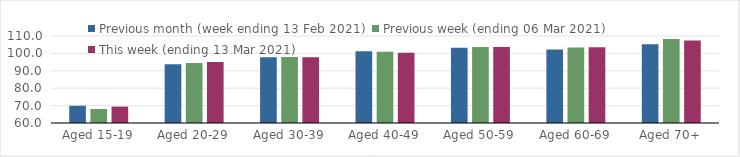
| Category | Previous month (week ending 13 Feb 2021) | Previous week (ending 06 Mar 2021) | This week (ending 13 Mar 2021) |
|---|---|---|---|
| Aged 15-19 | 69.91 | 68.03 | 69.42 |
| Aged 20-29 | 93.73 | 94.43 | 95.04 |
| Aged 30-39 | 97.75 | 97.86 | 97.81 |
| Aged 40-49 | 101.21 | 100.91 | 100.42 |
| Aged 50-59 | 103.25 | 103.62 | 103.7 |
| Aged 60-69 | 102.23 | 103.44 | 103.52 |
| Aged 70+ | 105.26 | 108.28 | 107.35 |